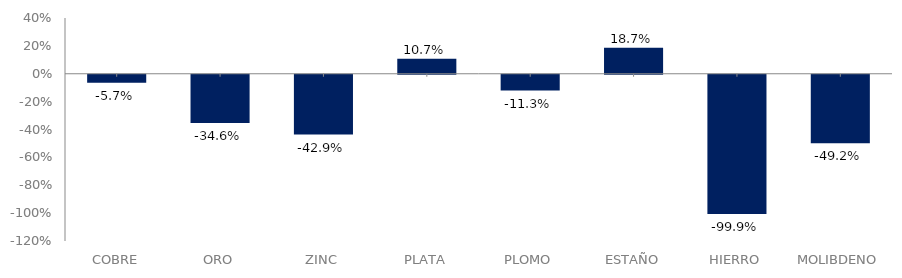
| Category | Series 0 |
|---|---|
| COBRE | -0.057 |
| ORO | -0.346 |
| ZINC | -0.429 |
| PLATA | 0.107 |
| PLOMO | -0.113 |
| ESTAÑO | 0.187 |
| HIERRO | -0.999 |
| MOLIBDENO | -0.492 |